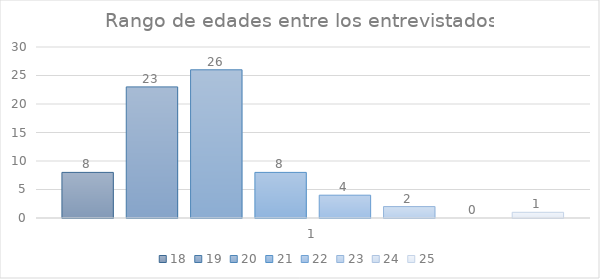
| Category | 18 | 19 | 20 | 21 | 22 | 23 | 24 | 25 |
|---|---|---|---|---|---|---|---|---|
| 0 | 8 | 23 | 26 | 8 | 4 | 2 | 0 | 1 |